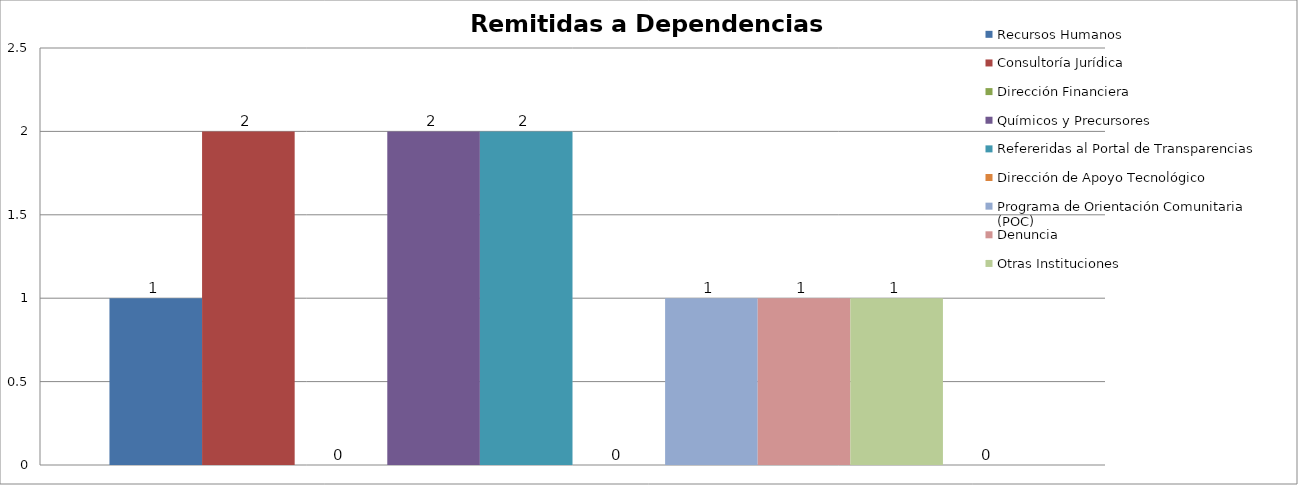
| Category | Recursos Humanos  | Consultoría Jurídica | Dirección Financiera | Químicos y Precursores | Refereridas al Portal de Transparencias | Dirección de Apoyo Tecnológico | Programa de Orientación Comunitaria (POC) | Denuncia | Otras Instituciones | Incompleta |
|---|---|---|---|---|---|---|---|---|---|---|
| 0 | 1 | 2 | 0 | 2 | 2 | 0 | 1 | 1 | 1 | 0 |